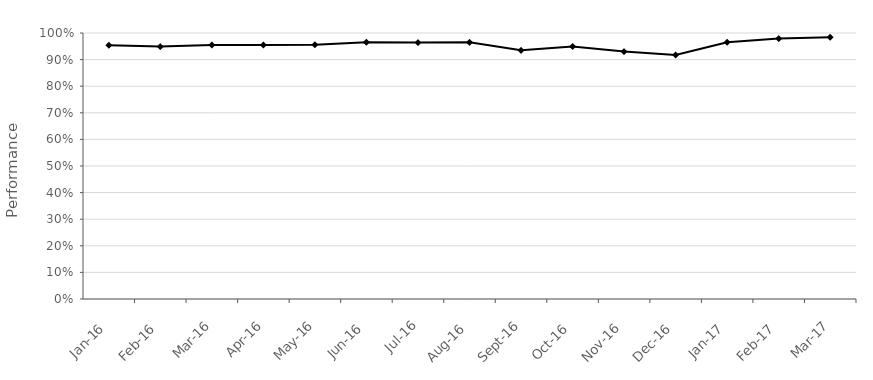
| Category | SCH9 SL001 |
|---|---|
| 2016-01-01 | 0.954 |
| 2016-02-01 | 0.949 |
| 2016-03-01 | 0.955 |
| 2016-04-01 | 0.955 |
| 2016-05-01 | 0.956 |
| 2016-06-01 | 0.965 |
| 2016-07-01 | 0.964 |
| 2016-08-01 | 0.965 |
| 2016-09-01 | 0.935 |
| 2016-10-01 | 0.949 |
| 2016-11-01 | 0.93 |
| 2016-12-01 | 0.917 |
| 2017-01-01 | 0.965 |
| 2017-02-01 | 0.979 |
| 2017-03-01 | 0.984 |